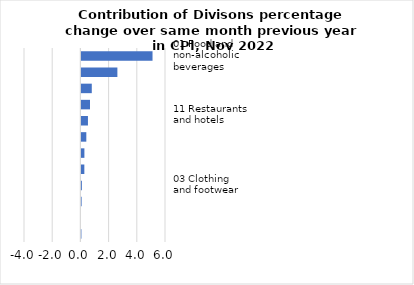
| Category |     Contributions |
|---|---|
| 01 Food and non-alcoholic beverages | 5.045 |
| 07 Transport | 2.552 |
| 08 Communication | 0.736 |
| 04 Housing, water, electricity, gas & other fuels | 0.611 |
| 11 Restaurants and hotels | 0.465 |
| 12 Miscellaneous goods & services | 0.349 |
| 05 Furnishings, household equipment & maintenance | 0.213 |
| 02 Alcoholic beverages, tobacco & narcotics | 0.209 |
| 03 Clothing and footwear | 0.033 |
| 09 Recreation and culture | 0.015 |
| 10 Education | 0 |
| 06 Health | -0.029 |